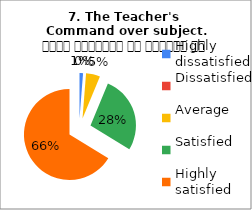
| Category | 7. The Teacher's 
Command over subject. विषय अवधारणा पर शिक्षक का ज्ञान |
|---|---|
| Highly dissatisfied | 1 |
| Dissatisfied | 0 |
| Average | 4 |
| Satisfied | 22 |
| Highly satisfied | 53 |